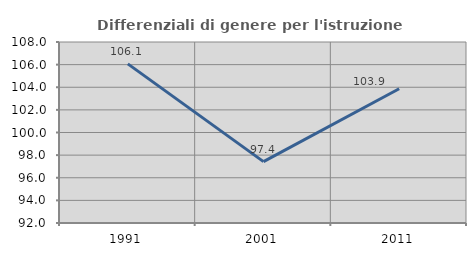
| Category | Differenziali di genere per l'istruzione superiore |
|---|---|
| 1991.0 | 106.068 |
| 2001.0 | 97.428 |
| 2011.0 | 103.867 |